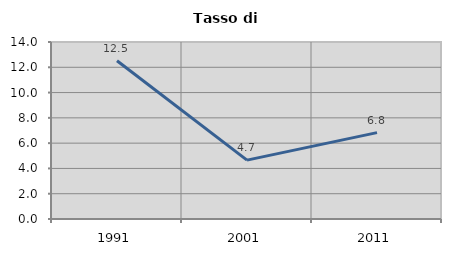
| Category | Tasso di disoccupazione   |
|---|---|
| 1991.0 | 12.52 |
| 2001.0 | 4.658 |
| 2011.0 | 6.834 |